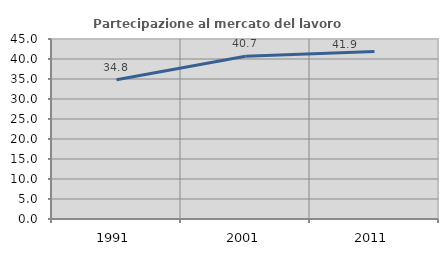
| Category | Partecipazione al mercato del lavoro  femminile |
|---|---|
| 1991.0 | 34.793 |
| 2001.0 | 40.686 |
| 2011.0 | 41.867 |